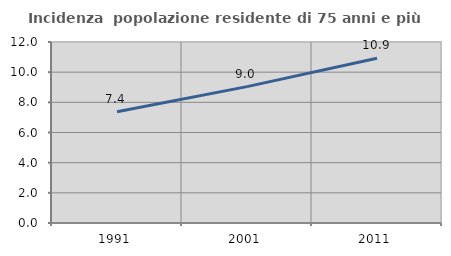
| Category | Incidenza  popolazione residente di 75 anni e più |
|---|---|
| 1991.0 | 7.377 |
| 2001.0 | 9.041 |
| 2011.0 | 10.919 |